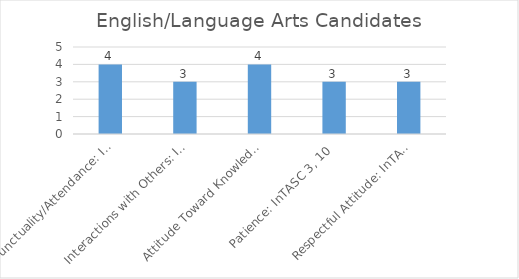
| Category | Series 0 |
|---|---|
| Punctuality/Attendance: InTASC 1, 9 | 4 |
| Interactions with Others: InTASC 3, 7, 10 | 3 |
| Attitude Toward Knowledge and Learning: InTASC 1, 4, 5, 9, 10 | 4 |
| Patience: InTASC 3, 10 | 3 |
| Respectful Attitude: InTASC 3, 7, 10 | 3 |